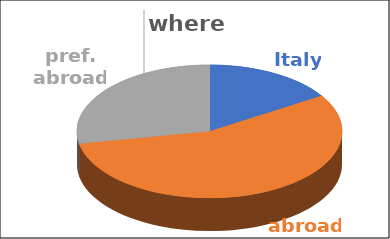
| Category | where | Series 1 | Series 2 | Series 3 | Series 4 |
|---|---|---|---|---|---|
| Italy | 0.16 |  |  |  |  |
| abroad | 0.56 |  |  |  |  |
| pref. abroad | 0.28 |  |  |  |  |